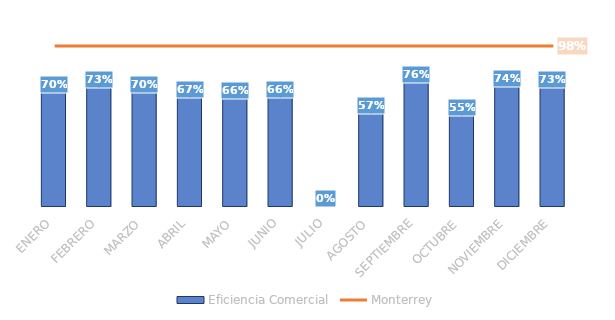
| Category | Eficiencia Comercial |
|---|---|
| ENERO | 0.699 |
| FEBRERO | 0.726 |
| MARZO | 0.698 |
| ABRIL | 0.665 |
| MAYO | 0.66 |
| JUNIO | 0.664 |
| JULIO | 0 |
| AGOSTO | 0.568 |
| SEPTIEMBRE | 0.761 |
| OCTUBRE | 0.554 |
| NOVIEMBRE | 0.736 |
| DICIEMBRE | 0.727 |